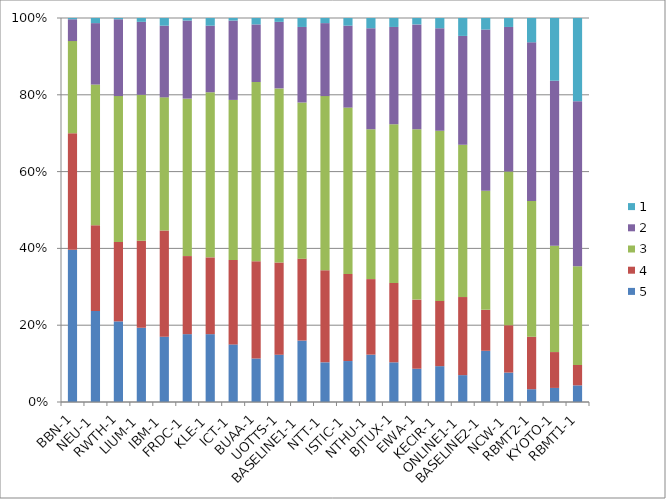
| Category | 5 | 4 | 3 | 2 | 1 |
|---|---|---|---|---|---|
| BBN-1 | 119 | 91 | 72 | 17 | 1 |
| NEU-1 | 71 | 67 | 110 | 48 | 4 |
| RWTH-1 | 63 | 62 | 114 | 60 | 1 |
| LIUM-1 | 58 | 68 | 114 | 57 | 3 |
| IBM-1 | 51 | 83 | 104 | 56 | 6 |
| FRDC-1 | 53 | 61 | 123 | 61 | 2 |
| KLE-1 | 53 | 60 | 129 | 52 | 6 |
| ICT-1 | 45 | 66 | 125 | 62 | 2 |
| BUAA-1 | 34 | 76 | 140 | 45 | 5 |
| UOTTS-1 | 37 | 72 | 136 | 52 | 3 |
| BASELINE1-1 | 48 | 64 | 122 | 59 | 7 |
| NTT-1 | 31 | 72 | 136 | 57 | 4 |
| ISTIC-1 | 32 | 68 | 130 | 64 | 6 |
| NTHU-1 | 37 | 59 | 117 | 79 | 8 |
| BJTUX-1 | 31 | 62 | 124 | 76 | 7 |
| EIWA-1 | 26 | 54 | 133 | 82 | 5 |
| KECIR-1 | 28 | 51 | 133 | 80 | 8 |
| ONLINE1-1 | 21 | 61 | 119 | 85 | 14 |
| BASELINE2-1 | 40 | 32 | 93 | 126 | 9 |
| NCW-1 | 23 | 37 | 120 | 113 | 7 |
| RBMT2-1 | 10 | 41 | 106 | 124 | 19 |
| KYOTO-1 | 11 | 28 | 83 | 129 | 49 |
| RBMT1-1 | 13 | 16 | 77 | 129 | 65 |